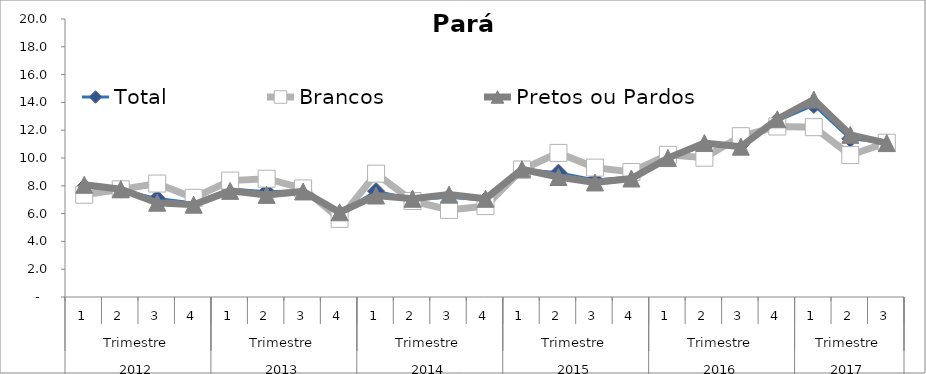
| Category | Total | Brancos | Pretos ou Pardos |
|---|---|---|---|
| 0 | 7.893 | 7.359 | 8.073 |
| 1 | 7.725 | 7.745 | 7.759 |
| 2 | 7.08 | 8.16 | 6.782 |
| 3 | 6.765 | 7.135 | 6.642 |
| 4 | 7.771 | 8.375 | 7.635 |
| 5 | 7.572 | 8.51 | 7.347 |
| 6 | 7.638 | 7.811 | 7.594 |
| 7 | 5.99 | 5.621 | 6.094 |
| 8 | 7.619 | 8.876 | 7.301 |
| 9 | 7.023 | 6.905 | 7.068 |
| 10 | 7.181 | 6.266 | 7.364 |
| 11 | 6.984 | 6.54 | 7.065 |
| 12 | 9.165 | 9.174 | 9.188 |
| 13 | 8.945 | 10.367 | 8.633 |
| 14 | 8.421 | 9.309 | 8.24 |
| 15 | 8.613 | 8.991 | 8.525 |
| 16 | 10.028 | 10.229 | 9.994 |
| 17 | 10.861 | 10.02 | 11.076 |
| 18 | 10.964 | 11.57 | 10.815 |
| 19 | 12.673 | 12.266 | 12.785 |
| 20 | 13.812 | 12.217 | 14.202 |
| 21 | 11.385 | 10.21 | 11.665 |
| 22 | 11.116 | 11.099 | 11.072 |